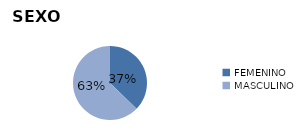
| Category | Series 0 |
|---|---|
| FEMENINO | 1039 |
| MASCULINO | 1750 |